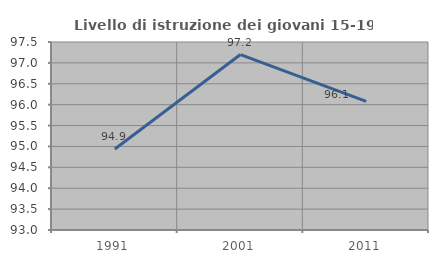
| Category | Livello di istruzione dei giovani 15-19 anni |
|---|---|
| 1991.0 | 94.94 |
| 2001.0 | 97.2 |
| 2011.0 | 96.078 |